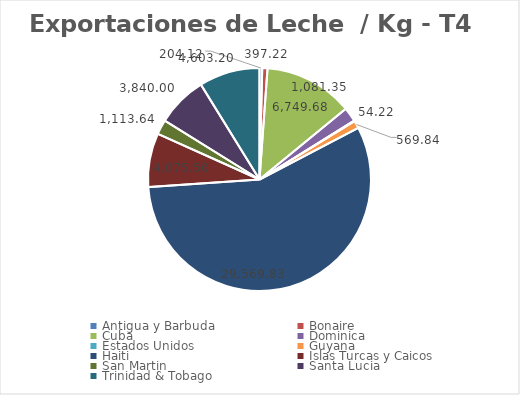
| Category | kg | Valor US  |
|---|---|---|
| Antigua y Barbuda | 204.12 | 255.6 |
| Bonaire | 397.22 | 12568.04 |
| Cuba | 6749.68 | 19326.52 |
| Dominica | 1081.35 | 1373.31 |
| Estados Unidos | 54.22 | 89.9 |
| Guyana | 569.84 | 756 |
| Haiti | 29569.83 | 94968.77 |
| Islas Turcas y Caicos | 4075.5 | 6569.82 |
| San Martin | 1113.64 | 1151.24 |
| Santa Lucia | 3840 | 31956 |
| Trinidad & Tobago | 4603.2 | 42410.12 |